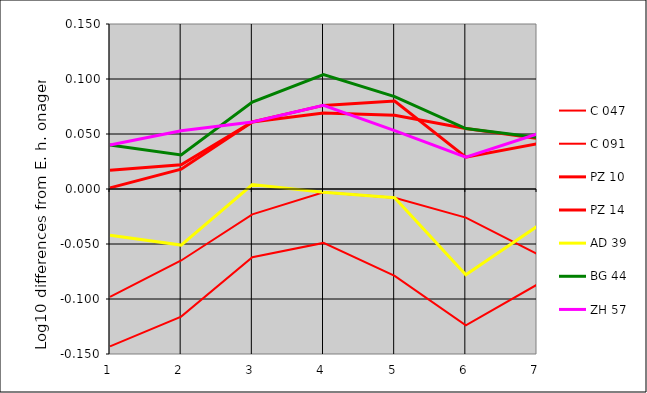
| Category | C 047 | C 091 | PZ 10 | PZ 14 | AD 39 | BG 44 | ZH 57 |
|---|---|---|---|---|---|---|---|
| 1.0 | -0.143 | -0.098 | 0.001 | 0.017 | -0.042 | 0.04 | 0.04 |
| 2.0 | -0.116 | -0.065 | 0.018 | 0.022 | -0.051 | 0.031 | 0.053 |
| 3.0 | -0.062 | -0.023 | 0.061 | 0.061 | 0.004 | 0.079 | 0.061 |
| 4.0 | -0.049 | -0.003 | 0.069 | 0.076 | -0.003 | 0.104 | 0.076 |
| 5.0 | -0.079 | -0.008 | 0.067 | 0.08 | -0.008 | 0.084 | 0.053 |
| 6.0 | -0.124 | -0.026 | 0.055 | 0.029 | -0.078 | 0.055 | 0.029 |
| 7.0 | -0.087 | -0.059 | 0.046 | 0.041 | -0.034 | 0.047 | 0.05 |